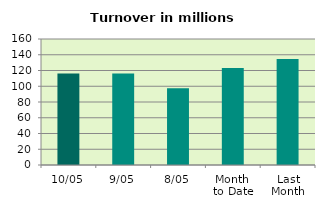
| Category | Series 0 |
|---|---|
| 10/05 | 116.145 |
| 9/05 | 116.149 |
| 8/05 | 97.598 |
| Month 
to Date | 123.227 |
| Last
Month | 134.694 |